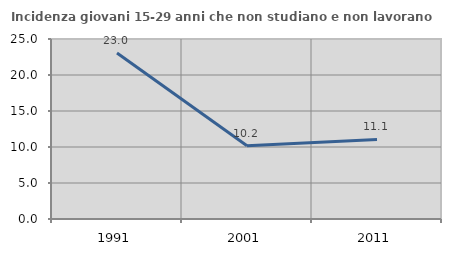
| Category | Incidenza giovani 15-29 anni che non studiano e non lavorano  |
|---|---|
| 1991.0 | 23.048 |
| 2001.0 | 10.185 |
| 2011.0 | 11.055 |